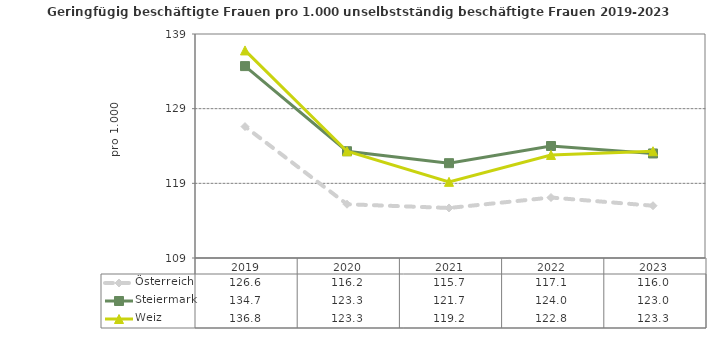
| Category | Österreich | Steiermark | Weiz |
|---|---|---|---|
| 2023.0 | 116 | 123 | 123.3 |
| 2022.0 | 117.1 | 124 | 122.8 |
| 2021.0 | 115.7 | 121.7 | 119.2 |
| 2020.0 | 116.2 | 123.3 | 123.3 |
| 2019.0 | 126.6 | 134.7 | 136.8 |